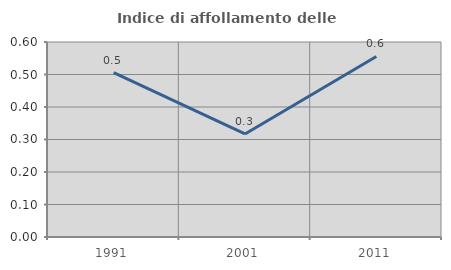
| Category | Indice di affollamento delle abitazioni  |
|---|---|
| 1991.0 | 0.506 |
| 2001.0 | 0.317 |
| 2011.0 | 0.556 |